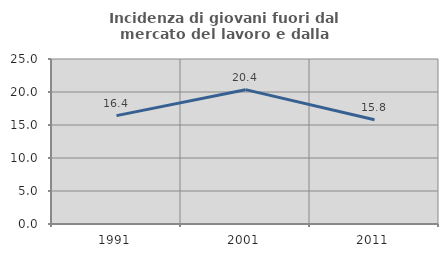
| Category | Incidenza di giovani fuori dal mercato del lavoro e dalla formazione  |
|---|---|
| 1991.0 | 16.423 |
| 2001.0 | 20.354 |
| 2011.0 | 15.789 |